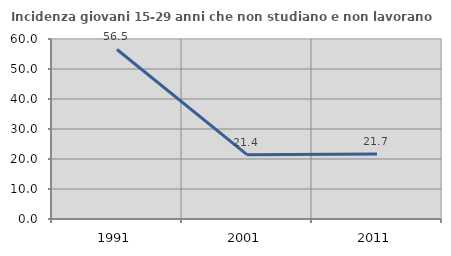
| Category | Incidenza giovani 15-29 anni che non studiano e non lavorano  |
|---|---|
| 1991.0 | 56.508 |
| 2001.0 | 21.443 |
| 2011.0 | 21.664 |